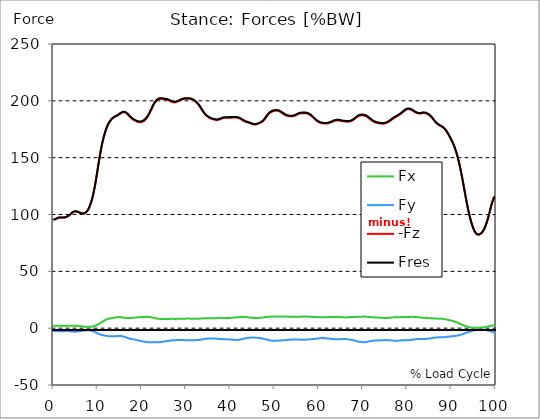
| Category |  Fx |  Fy |  -Fz |  Fres |
|---|---|---|---|---|
| 0.0 | 2.021 | -2.411 | 95.448 | 95.507 |
| 0.167348456675344 | 2.024 | -2.442 | 95.588 | 95.648 |
| 0.334696913350688 | 2.028 | -2.484 | 95.779 | 95.838 |
| 0.5020453700260321 | 2.035 | -2.538 | 96.024 | 96.086 |
| 0.669393826701376 | 2.042 | -2.602 | 96.321 | 96.384 |
| 0.83674228337672 | 2.05 | -2.669 | 96.655 | 96.721 |
| 1.0040907400520642 | 2.056 | -2.726 | 96.959 | 97.026 |
| 1.1621420602454444 | 2.06 | -2.761 | 97.179 | 97.247 |
| 1.3294905169207885 | 2.062 | -2.774 | 97.319 | 97.388 |
| 1.4968389735961325 | 2.06 | -2.769 | 97.39 | 97.458 |
| 1.6641874302714765 | 2.056 | -2.75 | 97.405 | 97.472 |
| 1.8315358869468206 | 2.05 | -2.72 | 97.379 | 97.446 |
| 1.9988843436221646 | 2.041 | -2.681 | 97.332 | 97.397 |
| 2.1662328002975086 | 2.034 | -2.64 | 97.293 | 97.358 |
| 2.333581256972853 | 2.029 | -2.6 | 97.294 | 97.359 |
| 2.5009297136481967 | 2.03 | -2.564 | 97.353 | 97.417 |
| 2.6682781703235405 | 2.036 | -2.534 | 97.479 | 97.542 |
| 2.8356266269988843 | 2.045 | -2.516 | 97.677 | 97.739 |
| 3.002975083674229 | 2.06 | -2.515 | 97.94 | 98.003 |
| 3.1703235403495724 | 2.079 | -2.536 | 98.264 | 98.329 |
| 3.337671997024917 | 2.101 | -2.574 | 98.644 | 98.708 |
| 3.4957233172182973 | 2.122 | -2.627 | 99.078 | 99.144 |
| 3.663071773893641 | 2.143 | -2.694 | 99.569 | 99.637 |
| 3.8304202305689854 | 2.164 | -2.773 | 100.122 | 100.193 |
| 3.997768687244329 | 2.185 | -2.861 | 100.728 | 100.801 |
| 4.165117143919673 | 2.199 | -2.948 | 101.322 | 101.398 |
| 4.332465600595017 | 2.202 | -3.022 | 101.845 | 101.922 |
| 4.499814057270361 | 2.193 | -3.079 | 102.248 | 102.326 |
| 4.667162513945706 | 2.174 | -3.112 | 102.524 | 102.604 |
| 4.834510970621049 | 2.144 | -3.125 | 102.681 | 102.761 |
| 5.001859427296393 | 2.105 | -3.117 | 102.729 | 102.807 |
| 5.169207883971737 | 2.059 | -3.087 | 102.68 | 102.756 |
| 5.336556340647081 | 2.006 | -3.038 | 102.551 | 102.625 |
| 5.503904797322425 | 1.95 | -2.971 | 102.359 | 102.43 |
| 5.671253253997769 | 1.891 | -2.887 | 102.12 | 102.188 |
| 5.82930457419115 | 1.829 | -2.788 | 101.852 | 101.917 |
| 5.996653030866494 | 1.764 | -2.679 | 101.573 | 101.634 |
| 6.164001487541838 | 1.696 | -2.564 | 101.299 | 101.356 |
| 6.331349944217181 | 1.625 | -2.448 | 101.064 | 101.117 |
| 6.498698400892526 | 1.555 | -2.332 | 100.896 | 100.946 |
| 6.66604685756787 | 1.485 | -2.221 | 100.825 | 100.871 |
| 6.833395314243213 | 1.418 | -2.115 | 100.86 | 100.903 |
| 7.000743770918558 | 1.354 | -2.019 | 101.012 | 101.052 |
| 7.168092227593902 | 1.298 | -1.939 | 101.306 | 101.344 |
| 7.335440684269246 | 1.25 | -1.879 | 101.753 | 101.79 |
| 7.50278914094459 | 1.21 | -1.84 | 102.367 | 102.403 |
| 7.6701375976199335 | 1.184 | -1.827 | 103.165 | 103.2 |
| 7.837486054295278 | 1.169 | -1.841 | 104.157 | 104.193 |
| 7.995537374488658 | 1.169 | -1.884 | 105.351 | 105.388 |
| 8.162885831164003 | 1.183 | -1.956 | 106.761 | 106.799 |
| 8.330234287839346 | 1.217 | -2.064 | 108.408 | 108.45 |
| 8.49758274451469 | 1.271 | -2.207 | 110.308 | 110.353 |
| 8.664931201190035 | 1.351 | -2.381 | 112.468 | 112.517 |
| 8.832279657865378 | 1.461 | -2.587 | 114.893 | 114.949 |
| 8.999628114540721 | 1.602 | -2.82 | 117.588 | 117.65 |
| 9.166976571216066 | 1.777 | -3.079 | 120.564 | 120.635 |
| 9.334325027891412 | 1.986 | -3.362 | 123.842 | 123.922 |
| 9.501673484566755 | 2.229 | -3.664 | 127.415 | 127.507 |
| 9.669021941242098 | 2.5 | -3.976 | 131.236 | 131.341 |
| 9.836370397917442 | 2.798 | -4.286 | 135.238 | 135.355 |
| 10.003718854592787 | 3.119 | -4.584 | 139.336 | 139.467 |
| 10.17106731126813 | 3.459 | -4.864 | 143.44 | 143.584 |
| 10.329118631461512 | 3.82 | -5.125 | 147.479 | 147.637 |
| 10.496467088136853 | 4.199 | -5.366 | 151.376 | 151.549 |
| 10.663815544812199 | 4.59 | -5.587 | 155.054 | 155.242 |
| 10.831164001487544 | 4.993 | -5.791 | 158.492 | 158.694 |
| 10.998512458162887 | 5.403 | -5.981 | 161.668 | 161.887 |
| 11.16586091483823 | 5.814 | -6.156 | 164.581 | 164.817 |
| 11.333209371513574 | 6.22 | -6.314 | 167.245 | 167.496 |
| 11.50055782818892 | 6.609 | -6.452 | 169.673 | 169.94 |
| 11.667906284864264 | 6.979 | -6.574 | 171.88 | 172.163 |
| 11.835254741539607 | 7.316 | -6.682 | 173.889 | 174.187 |
| 12.00260319821495 | 7.616 | -6.781 | 175.7 | 176.011 |
| 12.169951654890292 | 7.881 | -6.873 | 177.319 | 177.641 |
| 12.337300111565641 | 8.114 | -6.958 | 178.751 | 179.086 |
| 12.504648568240984 | 8.317 | -7.035 | 180.013 | 180.359 |
| 12.662699888434362 | 8.493 | -7.098 | 181.122 | 181.477 |
| 12.830048345109708 | 8.64 | -7.143 | 182.097 | 182.46 |
| 12.997396801785053 | 8.761 | -7.175 | 182.957 | 183.326 |
| 13.164745258460396 | 8.866 | -7.203 | 183.709 | 184.084 |
| 13.33209371513574 | 8.961 | -7.217 | 184.359 | 184.738 |
| 13.499442171811083 | 9.05 | -7.213 | 184.913 | 185.296 |
| 13.666790628486426 | 9.146 | -7.186 | 185.378 | 185.764 |
| 13.834139085161771 | 9.254 | -7.134 | 185.765 | 186.155 |
| 14.001487541837117 | 9.377 | -7.061 | 186.093 | 186.486 |
| 14.16883599851246 | 9.503 | -6.977 | 186.392 | 186.787 |
| 14.336184455187803 | 9.604 | -6.899 | 186.716 | 187.113 |
| 14.503532911863147 | 9.668 | -6.839 | 187.087 | 187.484 |
| 14.670881368538492 | 9.696 | -6.803 | 187.499 | 187.894 |
| 14.828932688731873 | 9.699 | -6.796 | 187.935 | 188.327 |
| 14.996281145407215 | 9.689 | -6.815 | 188.375 | 188.766 |
| 15.163629602082558 | 9.662 | -6.851 | 188.817 | 189.207 |
| 15.330978058757903 | 9.595 | -6.915 | 189.248 | 189.636 |
| 15.498326515433247 | 9.498 | -7.021 | 189.617 | 190.004 |
| 15.665674972108594 | 9.381 | -7.169 | 189.884 | 190.271 |
| 15.833023428783937 | 9.257 | -7.35 | 190.019 | 190.408 |
| 16.00037188545928 | 9.143 | -7.556 | 190.012 | 190.405 |
| 16.167720342134626 | 9.046 | -7.78 | 189.865 | 190.264 |
| 16.335068798809967 | 8.974 | -8.013 | 189.584 | 189.991 |
| 16.502417255485312 | 8.926 | -8.245 | 189.181 | 189.597 |
| 16.669765712160658 | 8.904 | -8.466 | 188.667 | 189.093 |
| 16.837114168836 | 8.905 | -8.675 | 188.053 | 188.491 |
| 17.004462625511344 | 8.923 | -8.873 | 187.371 | 187.821 |
| 17.16251394570472 | 8.952 | -9.064 | 186.669 | 187.132 |
| 17.32986240238007 | 8.986 | -9.246 | 185.988 | 186.464 |
| 17.497210859055414 | 9.025 | -9.416 | 185.337 | 185.825 |
| 17.664559315730756 | 9.071 | -9.568 | 184.733 | 185.232 |
| 17.8319077724061 | 9.121 | -9.702 | 184.185 | 184.696 |
| 17.999256229081443 | 9.168 | -9.817 | 183.697 | 184.218 |
| 18.166604685756788 | 9.21 | -9.923 | 183.261 | 183.791 |
| 18.333953142432133 | 9.251 | -10.034 | 182.865 | 183.404 |
| 18.501301599107478 | 9.3 | -10.152 | 182.503 | 183.05 |
| 18.668650055782823 | 9.355 | -10.283 | 182.169 | 182.729 |
| 18.835998512458165 | 9.415 | -10.419 | 181.871 | 182.442 |
| 19.00334696913351 | 9.477 | -10.559 | 181.614 | 182.196 |
| 19.170695425808855 | 9.538 | -10.71 | 181.409 | 182.005 |
| 19.338043882484197 | 9.599 | -10.871 | 181.267 | 181.875 |
| 19.496095202677576 | 9.653 | -11.04 | 181.195 | 181.816 |
| 19.66344365935292 | 9.699 | -11.209 | 181.194 | 181.827 |
| 19.830792116028263 | 9.743 | -11.364 | 181.267 | 181.911 |
| 19.998140572703612 | 9.787 | -11.493 | 181.423 | 182.077 |
| 20.165489029378953 | 9.825 | -11.598 | 181.661 | 182.321 |
| 20.3328374860543 | 9.86 | -11.697 | 181.986 | 182.653 |
| 20.500185942729644 | 9.891 | -11.8 | 182.413 | 183.086 |
| 20.667534399404985 | 9.917 | -11.91 | 182.945 | 183.624 |
| 20.83488285608033 | 9.943 | -12.026 | 183.579 | 184.264 |
| 21.002231312755672 | 9.967 | -12.141 | 184.311 | 185.003 |
| 21.16957976943102 | 9.977 | -12.238 | 185.15 | 185.844 |
| 21.336928226106362 | 9.962 | -12.311 | 186.108 | 186.803 |
| 21.504276682781704 | 9.921 | -12.363 | 187.189 | 187.881 |
| 21.67162513945705 | 9.862 | -12.404 | 188.384 | 189.071 |
| 21.82967645965043 | 9.786 | -12.436 | 189.68 | 190.361 |
| 21.997024916325774 | 9.692 | -12.457 | 191.05 | 191.721 |
| 22.16437337300112 | 9.581 | -12.469 | 192.458 | 193.122 |
| 22.33172182967646 | 9.453 | -12.474 | 193.861 | 194.515 |
| 22.499070286351806 | 9.304 | -12.47 | 195.205 | 195.848 |
| 22.666418743027148 | 9.143 | -12.462 | 196.454 | 197.086 |
| 22.833767199702496 | 8.978 | -12.452 | 197.585 | 198.205 |
| 23.00111565637784 | 8.813 | -12.445 | 198.583 | 199.192 |
| 23.168464113053183 | 8.651 | -12.438 | 199.442 | 200.04 |
| 23.335812569728528 | 8.509 | -12.428 | 200.16 | 200.749 |
| 23.50316102640387 | 8.391 | -12.41 | 200.735 | 201.315 |
| 23.670509483079215 | 8.298 | -12.38 | 201.17 | 201.743 |
| 23.83785793975456 | 8.233 | -12.336 | 201.479 | 202.045 |
| 23.995909259947936 | 8.186 | -12.283 | 201.675 | 202.235 |
| 24.163257716623285 | 8.158 | -12.221 | 201.772 | 202.326 |
| 24.330606173298627 | 8.142 | -12.153 | 201.793 | 202.342 |
| 24.49795462997397 | 8.134 | -12.077 | 201.757 | 202.301 |
| 24.665303086649313 | 8.13 | -11.988 | 201.676 | 202.214 |
| 24.83265154332466 | 8.125 | -11.891 | 201.573 | 202.106 |
| 25.0 | 8.117 | -11.782 | 201.472 | 201.998 |
| 25.167348456675345 | 8.108 | -11.671 | 201.381 | 201.9 |
| 25.334696913350694 | 8.107 | -11.562 | 201.31 | 201.823 |
| 25.502045370026035 | 8.109 | -11.455 | 201.228 | 201.735 |
| 25.669393826701377 | 8.114 | -11.357 | 201.088 | 201.589 |
| 25.836742283376722 | 8.116 | -11.268 | 200.879 | 201.375 |
| 26.004090740052067 | 8.117 | -11.184 | 200.625 | 201.118 |
| 26.17143919672741 | 8.126 | -11.103 | 200.34 | 200.829 |
| 26.329490516920792 | 8.146 | -11.019 | 200.021 | 200.507 |
| 26.49683897359613 | 8.167 | -10.933 | 199.687 | 200.169 |
| 26.66418743027148 | 8.184 | -10.839 | 199.357 | 199.836 |
| 26.831535886946828 | 8.193 | -10.749 | 199.061 | 199.536 |
| 26.998884343622166 | 8.191 | -10.672 | 198.835 | 199.306 |
| 27.166232800297514 | 8.181 | -10.613 | 198.689 | 199.156 |
| 27.333581256972852 | 8.17 | -10.572 | 198.633 | 199.097 |
| 27.5009297136482 | 8.165 | -10.544 | 198.668 | 199.13 |
| 27.668278170323543 | 8.171 | -10.526 | 198.797 | 199.258 |
| 27.835626626998888 | 8.179 | -10.513 | 199.008 | 199.467 |
| 28.002975083674233 | 8.188 | -10.5 | 199.292 | 199.749 |
| 28.170323540349575 | 8.196 | -10.483 | 199.62 | 200.075 |
| 28.33767199702492 | 8.205 | -10.461 | 199.964 | 200.417 |
| 28.50502045370026 | 8.208 | -10.442 | 200.283 | 200.735 |
| 28.663071773893645 | 8.207 | -10.433 | 200.56 | 201.009 |
| 28.830420230568986 | 8.209 | -10.433 | 200.816 | 201.264 |
| 28.99776868724433 | 8.214 | -10.447 | 201.075 | 201.524 |
| 29.165117143919673 | 8.221 | -10.477 | 201.33 | 201.78 |
| 29.33246560059502 | 8.236 | -10.508 | 201.549 | 202.001 |
| 29.499814057270367 | 8.259 | -10.533 | 201.703 | 202.158 |
| 29.66716251394571 | 8.3 | -10.55 | 201.799 | 202.256 |
| 29.834510970621054 | 8.351 | -10.552 | 201.842 | 202.303 |
| 30.00185942729639 | 8.402 | -10.55 | 201.85 | 202.313 |
| 30.169207883971744 | 8.445 | -10.549 | 201.835 | 202.301 |
| 30.33655634064708 | 8.47 | -10.55 | 201.814 | 202.281 |
| 30.50390479732243 | 8.468 | -10.554 | 201.801 | 202.268 |
| 30.671253253997772 | 8.44 | -10.556 | 201.793 | 202.259 |
| 30.829304574191156 | 8.39 | -10.556 | 201.77 | 202.234 |
| 30.996653030866494 | 8.339 | -10.557 | 201.69 | 202.15 |
| 31.164001487541842 | 8.294 | -10.558 | 201.533 | 201.992 |
| 31.331349944217187 | 8.257 | -10.559 | 201.304 | 201.762 |
| 31.498698400892525 | 8.224 | -10.557 | 201.008 | 201.464 |
| 31.666046857567874 | 8.2 | -10.553 | 200.65 | 201.104 |
| 31.833395314243212 | 8.185 | -10.545 | 200.228 | 200.682 |
| 32.00074377091856 | 8.182 | -10.531 | 199.745 | 200.199 |
| 32.1680922275939 | 8.19 | -10.511 | 199.202 | 199.656 |
| 32.33544068426925 | 8.207 | -10.487 | 198.603 | 199.058 |
| 32.50278914094459 | 8.23 | -10.458 | 197.951 | 198.406 |
| 32.670137597619934 | 8.258 | -10.421 | 197.243 | 197.698 |
| 32.83748605429528 | 8.294 | -10.369 | 196.464 | 196.92 |
| 33.004834510970625 | 8.338 | -10.299 | 195.601 | 196.056 |
| 33.162885831164004 | 8.389 | -10.21 | 194.659 | 195.114 |
| 33.33023428783935 | 8.444 | -10.105 | 193.648 | 194.101 |
| 33.497582744514695 | 8.501 | -9.986 | 192.584 | 193.036 |
| 33.664931201190036 | 8.557 | -9.855 | 191.526 | 191.977 |
| 33.83227965786538 | 8.609 | -9.72 | 190.524 | 190.973 |
| 33.99962811454073 | 8.654 | -9.587 | 189.597 | 190.043 |
| 34.16697657121607 | 8.689 | -9.468 | 188.76 | 189.203 |
| 34.33432502789141 | 8.71 | -9.372 | 188.017 | 188.458 |
| 34.50167348456676 | 8.716 | -9.305 | 187.365 | 187.805 |
| 34.6690219412421 | 8.709 | -9.248 | 186.778 | 187.216 |
| 34.83637039791744 | 8.696 | -9.196 | 186.242 | 186.679 |
| 35.00371885459279 | 8.678 | -9.152 | 185.761 | 186.196 |
| 35.17106731126814 | 8.658 | -9.117 | 185.331 | 185.764 |
| 35.338415767943474 | 8.644 | -9.092 | 184.95 | 185.383 |
| 35.49646708813686 | 8.635 | -9.073 | 184.624 | 185.057 |
| 35.6638155448122 | 8.627 | -9.058 | 184.349 | 184.78 |
| 35.831164001487544 | 8.62 | -9.05 | 184.117 | 184.549 |
| 35.998512458162885 | 8.618 | -9.057 | 183.918 | 184.35 |
| 36.165860914838234 | 8.632 | -9.08 | 183.731 | 184.165 |
| 36.333209371513576 | 8.665 | -9.11 | 183.55 | 183.988 |
| 36.50055782818892 | 8.719 | -9.147 | 183.382 | 183.826 |
| 36.667906284864266 | 8.79 | -9.193 | 183.248 | 183.697 |
| 36.83525474153961 | 8.868 | -9.247 | 183.16 | 183.617 |
| 37.002603198214956 | 8.943 | -9.299 | 183.141 | 183.604 |
| 37.1699516548903 | 9.007 | -9.35 | 183.199 | 183.668 |
| 37.337300111565646 | 9.054 | -9.4 | 183.335 | 183.808 |
| 37.50464856824098 | 9.083 | -9.45 | 183.536 | 184.013 |
| 37.66269988843437 | 9.092 | -9.5 | 183.782 | 184.263 |
| 37.83004834510971 | 9.084 | -9.55 | 184.053 | 184.535 |
| 37.99739680178505 | 9.065 | -9.599 | 184.326 | 184.807 |
| 38.16474525846039 | 9.039 | -9.64 | 184.578 | 185.06 |
| 38.33209371513574 | 9.011 | -9.679 | 184.802 | 185.283 |
| 38.49944217181109 | 8.984 | -9.711 | 184.98 | 185.462 |
| 38.666790628486424 | 8.962 | -9.741 | 185.102 | 185.583 |
| 38.83413908516178 | 8.944 | -9.764 | 185.165 | 185.647 |
| 39.001487541837115 | 8.932 | -9.781 | 185.177 | 185.658 |
| 39.16883599851246 | 8.925 | -9.797 | 185.159 | 185.64 |
| 39.336184455187805 | 8.927 | -9.817 | 185.146 | 185.629 |
| 39.503532911863154 | 8.936 | -9.843 | 185.15 | 185.635 |
| 39.670881368538495 | 8.957 | -9.876 | 185.167 | 185.654 |
| 39.83822982521384 | 8.99 | -9.916 | 185.193 | 185.683 |
| 39.996281145407224 | 9.035 | -9.964 | 185.214 | 185.709 |
| 40.163629602082565 | 9.092 | -10.02 | 185.222 | 185.724 |
| 40.33097805875791 | 9.153 | -10.079 | 185.223 | 185.732 |
| 40.498326515433256 | 9.214 | -10.136 | 185.223 | 185.738 |
| 40.6656749721086 | 9.272 | -10.188 | 185.233 | 185.755 |
| 40.83302342878393 | 9.326 | -10.235 | 185.259 | 185.786 |
| 41.00037188545929 | 9.377 | -10.275 | 185.292 | 185.823 |
| 41.16772034213463 | 9.428 | -10.309 | 185.309 | 185.846 |
| 41.33506879880997 | 9.484 | -10.331 | 185.288 | 185.829 |
| 41.50241725548531 | 9.544 | -10.336 | 185.217 | 185.762 |
| 41.66976571216066 | 9.607 | -10.321 | 185.092 | 185.639 |
| 41.837114168836 | 9.668 | -10.283 | 184.913 | 185.462 |
| 42.004462625511344 | 9.728 | -10.219 | 184.679 | 185.229 |
| 42.17181108218669 | 9.784 | -10.128 | 184.393 | 184.942 |
| 42.32986240238007 | 9.838 | -10.015 | 184.059 | 184.606 |
| 42.497210859055414 | 9.886 | -9.876 | 183.675 | 184.219 |
| 42.66455931573076 | 9.921 | -9.713 | 183.257 | 183.795 |
| 42.831907772406105 | 9.94 | -9.535 | 182.835 | 183.366 |
| 42.999256229081446 | 9.942 | -9.347 | 182.441 | 182.964 |
| 43.16660468575679 | 9.923 | -9.16 | 182.091 | 182.606 |
| 43.33395314243214 | 9.882 | -8.984 | 181.786 | 182.291 |
| 43.50130159910748 | 9.817 | -8.824 | 181.529 | 182.022 |
| 43.66865005578282 | 9.732 | -8.687 | 181.306 | 181.789 |
| 43.83599851245817 | 9.638 | -8.573 | 181.105 | 181.578 |
| 44.00334696913351 | 9.544 | -8.49 | 180.919 | 181.382 |
| 44.17069542580886 | 9.452 | -8.428 | 180.73 | 181.185 |
| 44.3380438824842 | 9.365 | -8.383 | 180.521 | 180.969 |
| 44.49609520267758 | 9.284 | -8.349 | 180.287 | 180.728 |
| 44.66344365935292 | 9.207 | -8.321 | 180.028 | 180.465 |
| 44.83079211602827 | 9.14 | -8.3 | 179.764 | 180.195 |
| 44.99814057270361 | 9.085 | -8.285 | 179.523 | 179.951 |
| 45.16548902937895 | 9.042 | -8.284 | 179.34 | 179.766 |
| 45.332837486054295 | 9.01 | -8.296 | 179.223 | 179.65 |
| 45.500185942729644 | 8.992 | -8.323 | 179.179 | 179.604 |
| 45.66753439940499 | 8.983 | -8.364 | 179.198 | 179.624 |
| 45.83488285608033 | 8.987 | -8.413 | 179.282 | 179.711 |
| 46.00223131275568 | 8.999 | -8.471 | 179.425 | 179.858 |
| 46.16957976943102 | 9.018 | -8.536 | 179.626 | 180.062 |
| 46.336928226106366 | 9.045 | -8.603 | 179.875 | 180.314 |
| 46.50427668278171 | 9.084 | -8.674 | 180.148 | 180.593 |
| 46.671625139457056 | 9.135 | -8.75 | 180.434 | 180.883 |
| 46.829676459650436 | 9.195 | -8.837 | 180.735 | 181.19 |
| 46.99702491632577 | 9.257 | -8.936 | 181.07 | 181.533 |
| 47.16437337300112 | 9.325 | -9.05 | 181.465 | 181.937 |
| 47.33172182967646 | 9.404 | -9.181 | 181.954 | 182.435 |
| 47.49907028635181 | 9.489 | -9.327 | 182.552 | 183.044 |
| 47.66641874302716 | 9.581 | -9.489 | 183.27 | 183.773 |
| 47.83376719970249 | 9.681 | -9.673 | 184.112 | 184.627 |
| 48.001115656377834 | 9.789 | -9.866 | 185.042 | 185.571 |
| 48.16846411305319 | 9.889 | -10.05 | 185.981 | 186.522 |
| 48.33581256972853 | 9.971 | -10.217 | 186.863 | 187.416 |
| 48.50316102640387 | 10.034 | -10.373 | 187.666 | 188.229 |
| 48.67050948307921 | 10.077 | -10.519 | 188.38 | 188.951 |
| 48.837857939754564 | 10.104 | -10.649 | 189.006 | 189.584 |
| 49.005206396429905 | 10.126 | -10.768 | 189.541 | 190.126 |
| 49.163257716623285 | 10.148 | -10.876 | 189.986 | 190.579 |
| 49.33060617329863 | 10.17 | -10.967 | 190.35 | 190.949 |
| 49.49795462997397 | 10.192 | -11.039 | 190.643 | 191.246 |
| 49.66530308664932 | 10.212 | -11.089 | 190.872 | 191.479 |
| 49.832651543324666 | 10.23 | -11.115 | 191.046 | 191.656 |
| 50.0 | 10.242 | -11.12 | 191.176 | 191.786 |
| 50.16734845667534 | 10.244 | -11.101 | 191.267 | 191.878 |
| 50.33469691335069 | 10.234 | -11.064 | 191.323 | 191.931 |
| 50.50204537002604 | 10.213 | -11.01 | 191.34 | 191.944 |
| 50.66939382670139 | 10.192 | -10.95 | 191.3 | 191.899 |
| 50.836742283376715 | 10.179 | -10.888 | 191.176 | 191.771 |
| 51.00409074005207 | 10.177 | -10.829 | 190.964 | 191.557 |
| 51.17143919672741 | 10.181 | -10.775 | 190.664 | 191.255 |
| 51.32949051692079 | 10.189 | -10.729 | 190.3 | 190.89 |
| 51.496838973596134 | 10.198 | -10.697 | 189.909 | 190.499 |
| 51.66418743027148 | 10.21 | -10.673 | 189.495 | 190.085 |
| 51.831535886946824 | 10.218 | -10.648 | 189.06 | 189.65 |
| 51.99888434362217 | 10.22 | -10.621 | 188.612 | 189.203 |
| 52.16623280029752 | 10.213 | -10.593 | 188.167 | 188.757 |
| 52.33358125697285 | 10.206 | -10.564 | 187.748 | 188.336 |
| 52.5009297136482 | 10.198 | -10.528 | 187.374 | 187.961 |
| 52.668278170323546 | 10.185 | -10.48 | 187.058 | 187.642 |
| 52.835626626998895 | 10.159 | -10.414 | 186.815 | 187.395 |
| 53.00297508367424 | 10.127 | -10.34 | 186.626 | 187.202 |
| 53.17032354034958 | 10.092 | -10.263 | 186.483 | 187.053 |
| 53.33767199702492 | 10.056 | -10.183 | 186.392 | 186.956 |
| 53.50502045370027 | 10.031 | -10.106 | 186.341 | 186.9 |
| 53.663071773893655 | 10.018 | -10.036 | 186.321 | 186.877 |
| 53.83042023056899 | 10.017 | -9.983 | 186.333 | 186.885 |
| 53.99776868724433 | 10.021 | -9.952 | 186.38 | 186.931 |
| 54.16511714391967 | 10.021 | -9.946 | 186.471 | 187.021 |
| 54.33246560059503 | 10.016 | -9.953 | 186.609 | 187.158 |
| 54.49981405727037 | 10.003 | -9.966 | 186.801 | 187.35 |
| 54.667162513945705 | 9.989 | -9.985 | 187.045 | 187.593 |
| 54.834510970621054 | 9.972 | -10.002 | 187.338 | 187.885 |
| 55.0018594272964 | 9.957 | -10.013 | 187.673 | 188.219 |
| 55.169207883971744 | 9.948 | -10.021 | 188.025 | 188.57 |
| 55.336556340647086 | 9.947 | -10.026 | 188.349 | 188.892 |
| 55.50390479732243 | 9.959 | -10.037 | 188.613 | 189.157 |
| 55.671253253997776 | 9.991 | -10.056 | 188.817 | 189.364 |
| 55.83860171067312 | 10.036 | -10.081 | 188.962 | 189.512 |
| 55.9966530308665 | 10.101 | -10.115 | 189.056 | 189.612 |
| 56.16400148754184 | 10.172 | -10.145 | 189.112 | 189.674 |
| 56.33134994421718 | 10.236 | -10.159 | 189.137 | 189.704 |
| 56.498698400892536 | 10.287 | -10.161 | 189.143 | 189.713 |
| 56.66604685756788 | 10.32 | -10.151 | 189.147 | 189.718 |
| 56.83339531424321 | 10.331 | -10.133 | 189.136 | 189.707 |
| 57.00074377091856 | 10.326 | -10.107 | 189.102 | 189.672 |
| 57.16809222759391 | 10.309 | -10.073 | 189.033 | 189.6 |
| 57.33544068426925 | 10.278 | -10.032 | 188.908 | 189.473 |
| 57.5027891409446 | 10.232 | -9.984 | 188.717 | 189.276 |
| 57.670137597619934 | 10.177 | -9.934 | 188.452 | 189.007 |
| 57.83748605429528 | 10.117 | -9.885 | 188.124 | 188.674 |
| 58.004834510970625 | 10.055 | -9.836 | 187.738 | 188.283 |
| 58.16288583116401 | 9.996 | -9.778 | 187.297 | 187.837 |
| 58.330234287839346 | 9.942 | -9.716 | 186.804 | 187.338 |
| 58.497582744514695 | 9.896 | -9.655 | 186.255 | 186.786 |
| 58.66493120119004 | 9.858 | -9.597 | 185.654 | 186.181 |
| 58.832279657865385 | 9.834 | -9.542 | 185.015 | 185.54 |
| 58.999628114540734 | 9.819 | -9.479 | 184.379 | 184.902 |
| 59.16697657121607 | 9.804 | -9.401 | 183.762 | 184.281 |
| 59.33432502789142 | 9.789 | -9.314 | 183.169 | 183.685 |
| 59.50167348456676 | 9.771 | -9.222 | 182.619 | 183.131 |
| 59.66902194124211 | 9.745 | -9.129 | 182.125 | 182.633 |
| 59.83637039791745 | 9.714 | -9.037 | 181.691 | 182.193 |
| 60.00371885459278 | 9.68 | -8.951 | 181.315 | 181.811 |
| 60.17106731126813 | 9.644 | -8.873 | 180.994 | 181.486 |
| 60.33841576794349 | 9.607 | -8.804 | 180.727 | 181.214 |
| 60.49646708813685 | 9.574 | -8.749 | 180.516 | 181 |
| 60.6638155448122 | 9.546 | -8.712 | 180.363 | 180.843 |
| 60.831164001487544 | 9.524 | -8.7 | 180.257 | 180.736 |
| 60.99851245816289 | 9.515 | -8.71 | 180.173 | 180.652 |
| 61.16586091483824 | 9.521 | -8.743 | 180.092 | 180.574 |
| 61.333209371513576 | 9.549 | -8.796 | 180.024 | 180.51 |
| 61.50055782818892 | 9.594 | -8.869 | 179.982 | 180.475 |
| 61.667906284864266 | 9.654 | -8.955 | 179.979 | 180.479 |
| 61.835254741539615 | 9.716 | -9.043 | 180.023 | 180.533 |
| 62.002603198214956 | 9.768 | -9.125 | 180.126 | 180.642 |
| 62.16995165489029 | 9.806 | -9.193 | 180.283 | 180.805 |
| 62.33730011156564 | 9.829 | -9.251 | 180.482 | 181.007 |
| 62.504648568240995 | 9.84 | -9.307 | 180.711 | 181.238 |
| 62.67199702491633 | 9.841 | -9.366 | 180.958 | 181.489 |
| 62.83004834510971 | 9.833 | -9.426 | 181.218 | 181.75 |
| 62.99739680178505 | 9.819 | -9.482 | 181.488 | 182.021 |
| 63.1647452584604 | 9.807 | -9.537 | 181.76 | 182.294 |
| 63.33209371513575 | 9.802 | -9.589 | 182.027 | 182.563 |
| 63.4994421718111 | 9.807 | -9.634 | 182.278 | 182.814 |
| 63.666790628486424 | 9.822 | -9.669 | 182.498 | 183.037 |
| 63.83413908516177 | 9.842 | -9.698 | 182.668 | 183.208 |
| 64.00148754183712 | 9.859 | -9.721 | 182.776 | 183.318 |
| 64.16883599851248 | 9.872 | -9.741 | 182.821 | 183.364 |
| 64.3361844551878 | 9.881 | -9.755 | 182.811 | 183.355 |
| 64.50353291186315 | 9.882 | -9.762 | 182.752 | 183.297 |
| 64.6708813685385 | 9.87 | -9.753 | 182.652 | 183.196 |
| 64.83822982521384 | 9.844 | -9.732 | 182.526 | 183.067 |
| 65.00557828188919 | 9.801 | -9.698 | 182.392 | 182.929 |
| 65.16362960208257 | 9.744 | -9.661 | 182.265 | 182.798 |
| 65.3309780587579 | 9.677 | -9.623 | 182.15 | 182.678 |
| 65.49832651543326 | 9.603 | -9.593 | 182.052 | 182.575 |
| 65.6656749721086 | 9.534 | -9.581 | 181.97 | 182.489 |
| 65.83302342878395 | 9.485 | -9.593 | 181.893 | 182.41 |
| 66.00037188545929 | 9.456 | -9.618 | 181.819 | 182.336 |
| 66.16772034213463 | 9.449 | -9.651 | 181.745 | 182.264 |
| 66.33506879880998 | 9.47 | -9.703 | 181.677 | 182.2 |
| 66.50241725548531 | 9.518 | -9.77 | 181.622 | 182.152 |
| 66.66976571216065 | 9.581 | -9.85 | 181.605 | 182.142 |
| 66.83711416883601 | 9.651 | -9.939 | 181.649 | 182.194 |
| 67.00446262551135 | 9.715 | -10.033 | 181.77 | 182.323 |
| 67.1718110821867 | 9.769 | -10.133 | 181.966 | 182.527 |
| 67.32986240238007 | 9.814 | -10.24 | 182.224 | 182.793 |
| 67.49721085905541 | 9.85 | -10.358 | 182.535 | 183.11 |
| 67.66455931573076 | 9.876 | -10.484 | 182.893 | 183.476 |
| 67.83190777240611 | 9.893 | -10.62 | 183.302 | 183.892 |
| 67.99925622908145 | 9.903 | -10.768 | 183.763 | 184.36 |
| 68.16660468575678 | 9.907 | -10.936 | 184.273 | 184.877 |
| 68.33395314243214 | 9.916 | -11.123 | 184.796 | 185.409 |
| 68.50130159910749 | 9.932 | -11.335 | 185.327 | 185.952 |
| 68.66865005578282 | 9.953 | -11.549 | 185.836 | 186.472 |
| 68.83599851245816 | 9.976 | -11.734 | 186.269 | 186.916 |
| 69.00334696913352 | 10.001 | -11.885 | 186.617 | 187.273 |
| 69.17069542580886 | 10.03 | -12.008 | 186.886 | 187.551 |
| 69.3380438824842 | 10.063 | -12.106 | 187.087 | 187.76 |
| 69.50539233915956 | 10.097 | -12.179 | 187.221 | 187.9 |
| 69.66344365935292 | 10.131 | -12.235 | 187.289 | 187.974 |
| 69.83079211602826 | 10.159 | -12.271 | 187.294 | 187.984 |
| 69.99814057270362 | 10.179 | -12.291 | 187.245 | 187.937 |
| 70.16548902937896 | 10.184 | -12.296 | 187.157 | 187.85 |
| 70.33283748605429 | 10.176 | -12.283 | 187.018 | 187.711 |
| 70.50018594272964 | 10.155 | -12.244 | 186.813 | 187.504 |
| 70.667534399405 | 10.119 | -12.177 | 186.54 | 187.226 |
| 70.83488285608033 | 10.069 | -12.082 | 186.206 | 186.884 |
| 71.00223131275568 | 10.006 | -11.964 | 185.809 | 186.479 |
| 71.16957976943102 | 9.934 | -11.828 | 185.354 | 186.014 |
| 71.33692822610637 | 9.854 | -11.678 | 184.839 | 185.487 |
| 71.50427668278171 | 9.778 | -11.534 | 184.289 | 184.927 |
| 71.67162513945706 | 9.707 | -11.407 | 183.736 | 184.365 |
| 71.8389735961324 | 9.642 | -11.3 | 183.209 | 183.83 |
| 71.99702491632577 | 9.589 | -11.207 | 182.732 | 183.347 |
| 72.16437337300113 | 9.547 | -11.124 | 182.304 | 182.912 |
| 72.33172182967647 | 9.518 | -11.055 | 181.915 | 182.52 |
| 72.49907028635181 | 9.495 | -10.995 | 181.571 | 182.172 |
| 72.66641874302715 | 9.476 | -10.94 | 181.278 | 181.876 |
| 72.8337671997025 | 9.453 | -10.892 | 181.031 | 181.625 |
| 73.00111565637783 | 9.427 | -10.847 | 180.818 | 181.408 |
| 73.16846411305319 | 9.395 | -10.807 | 180.63 | 181.218 |
| 73.33581256972853 | 9.357 | -10.769 | 180.466 | 181.05 |
| 73.50316102640387 | 9.312 | -10.735 | 180.327 | 180.907 |
| 73.67050948307921 | 9.262 | -10.707 | 180.214 | 180.791 |
| 73.83785793975457 | 9.208 | -10.681 | 180.124 | 180.697 |
| 74.00520639642991 | 9.159 | -10.655 | 180.046 | 180.616 |
| 74.16325771662328 | 9.122 | -10.631 | 179.978 | 180.544 |
| 74.33060617329863 | 9.094 | -10.607 | 179.929 | 180.493 |
| 74.49795462997398 | 9.073 | -10.584 | 179.914 | 180.476 |
| 74.66530308664932 | 9.053 | -10.562 | 179.947 | 180.506 |
| 74.83265154332466 | 9.036 | -10.54 | 180.035 | 180.592 |
| 75.00000000000001 | 9.025 | -10.521 | 180.178 | 180.733 |
| 75.16734845667534 | 9.025 | -10.507 | 180.374 | 180.927 |
| 75.3346969133507 | 9.034 | -10.503 | 180.618 | 181.17 |
| 75.50204537002605 | 9.052 | -10.514 | 180.912 | 181.466 |
| 75.66939382670138 | 9.081 | -10.54 | 181.253 | 181.809 |
| 75.83674228337672 | 9.121 | -10.579 | 181.634 | 182.193 |
| 76.00409074005208 | 9.174 | -10.633 | 182.05 | 182.616 |
| 76.17143919672742 | 9.236 | -10.697 | 182.499 | 183.07 |
| 76.33878765340276 | 9.303 | -10.769 | 182.97 | 183.548 |
| 76.49683897359614 | 9.371 | -10.842 | 183.449 | 184.033 |
| 76.66418743027148 | 9.439 | -10.915 | 183.921 | 184.512 |
| 76.83153588694682 | 9.503 | -10.983 | 184.379 | 184.976 |
| 76.99888434362218 | 9.56 | -11.043 | 184.814 | 185.418 |
| 77.16623280029752 | 9.605 | -11.086 | 185.224 | 185.833 |
| 77.33358125697285 | 9.632 | -11.108 | 185.606 | 186.217 |
| 77.5009297136482 | 9.647 | -11.107 | 185.981 | 186.593 |
| 77.66827817032356 | 9.651 | -11.082 | 186.367 | 186.978 |
| 77.83562662699889 | 9.656 | -11.037 | 186.76 | 187.367 |
| 78.00297508367423 | 9.665 | -10.983 | 187.155 | 187.759 |
| 78.17032354034959 | 9.675 | -10.917 | 187.549 | 188.148 |
| 78.33767199702493 | 9.686 | -10.848 | 187.961 | 188.555 |
| 78.50502045370027 | 9.7 | -10.785 | 188.408 | 188.998 |
| 78.67236891037561 | 9.717 | -10.743 | 188.895 | 189.481 |
| 78.83042023056899 | 9.737 | -10.721 | 189.414 | 189.998 |
| 78.99776868724433 | 9.761 | -10.716 | 189.957 | 190.54 |
| 79.16511714391969 | 9.779 | -10.726 | 190.52 | 191.103 |
| 79.33246560059503 | 9.787 | -10.737 | 191.072 | 191.654 |
| 79.49981405727036 | 9.794 | -10.738 | 191.579 | 192.159 |
| 79.66716251394571 | 9.807 | -10.721 | 192.009 | 192.588 |
| 79.83451097062107 | 9.825 | -10.69 | 192.351 | 192.928 |
| 80.00185942729641 | 9.847 | -10.648 | 192.593 | 193.167 |
| 80.16920788397174 | 9.869 | -10.598 | 192.735 | 193.307 |
| 80.33655634064709 | 9.892 | -10.541 | 192.767 | 193.336 |
| 80.50390479732243 | 9.913 | -10.477 | 192.695 | 193.262 |
| 80.67125325399778 | 9.933 | -10.403 | 192.53 | 193.093 |
| 80.83860171067312 | 9.947 | -10.321 | 192.283 | 192.843 |
| 80.99665303086651 | 9.95 | -10.228 | 191.967 | 192.523 |
| 81.16400148754184 | 9.942 | -10.13 | 191.599 | 192.15 |
| 81.3313499442172 | 9.923 | -10.026 | 191.188 | 191.733 |
| 81.49869840089255 | 9.891 | -9.92 | 190.748 | 191.287 |
| 81.66604685756786 | 9.851 | -9.819 | 190.309 | 190.842 |
| 81.83339531424322 | 9.807 | -9.732 | 189.911 | 190.437 |
| 82.00074377091858 | 9.758 | -9.658 | 189.568 | 190.089 |
| 82.16809222759392 | 9.702 | -9.596 | 189.289 | 189.803 |
| 82.33544068426926 | 9.639 | -9.544 | 189.072 | 189.58 |
| 82.50278914094459 | 9.568 | -9.501 | 188.92 | 189.421 |
| 82.67013759761994 | 9.493 | -9.465 | 188.832 | 189.328 |
| 82.83748605429528 | 9.414 | -9.44 | 188.807 | 189.296 |
| 83.00483451097062 | 9.336 | -9.43 | 188.847 | 189.331 |
| 83.17218296764597 | 9.265 | -9.436 | 188.946 | 189.426 |
| 83.33023428783935 | 9.207 | -9.451 | 189.095 | 189.572 |
| 83.4975827445147 | 9.161 | -9.471 | 189.256 | 189.731 |
| 83.66493120119004 | 9.126 | -9.485 | 189.38 | 189.854 |
| 83.83227965786537 | 9.094 | -9.49 | 189.412 | 189.884 |
| 83.99962811454073 | 9.062 | -9.483 | 189.35 | 189.821 |
| 84.16697657121607 | 9.026 | -9.461 | 189.198 | 189.666 |
| 84.33432502789142 | 8.989 | -9.42 | 188.962 | 189.427 |
| 84.50167348456677 | 8.946 | -9.363 | 188.651 | 189.112 |
| 84.6690219412421 | 8.897 | -9.293 | 188.281 | 188.738 |
| 84.83637039791745 | 8.844 | -9.212 | 187.864 | 188.315 |
| 85.0037188545928 | 8.79 | -9.126 | 187.398 | 187.844 |
| 85.17106731126813 | 8.741 | -9.032 | 186.875 | 187.316 |
| 85.33841576794349 | 8.7 | -8.928 | 186.283 | 186.719 |
| 85.50576422461883 | 8.665 | -8.813 | 185.616 | 186.047 |
| 85.66381554481221 | 8.638 | -8.691 | 184.867 | 185.293 |
| 85.83116400148755 | 8.617 | -8.564 | 184.034 | 184.456 |
| 85.99851245816289 | 8.593 | -8.444 | 183.145 | 183.564 |
| 86.16586091483823 | 8.559 | -8.343 | 182.289 | 182.706 |
| 86.33320937151358 | 8.518 | -8.259 | 181.507 | 181.921 |
| 86.50055782818893 | 8.474 | -8.19 | 180.805 | 181.216 |
| 86.66790628486427 | 8.43 | -8.136 | 180.182 | 180.592 |
| 86.83525474153961 | 8.393 | -8.099 | 179.638 | 180.047 |
| 87.00260319821496 | 8.37 | -8.083 | 179.162 | 179.569 |
| 87.16995165489031 | 8.363 | -8.081 | 178.729 | 179.138 |
| 87.33730011156564 | 8.365 | -8.09 | 178.331 | 178.742 |
| 87.504648568241 | 8.368 | -8.1 | 177.957 | 178.369 |
| 87.67199702491634 | 8.364 | -8.104 | 177.594 | 178.007 |
| 87.83004834510972 | 8.343 | -8.097 | 177.222 | 177.635 |
| 87.99739680178506 | 8.293 | -8.075 | 176.815 | 177.223 |
| 88.1647452584604 | 8.206 | -8.031 | 176.345 | 176.748 |
| 88.33209371513574 | 8.089 | -7.96 | 175.78 | 176.175 |
| 88.49944217181108 | 7.953 | -7.872 | 175.11 | 175.494 |
| 88.66679062848644 | 7.806 | -7.777 | 174.331 | 174.706 |
| 88.83413908516178 | 7.651 | -7.678 | 173.446 | 173.809 |
| 89.00148754183712 | 7.498 | -7.583 | 172.469 | 172.824 |
| 89.16883599851246 | 7.35 | -7.497 | 171.417 | 171.764 |
| 89.33618445518782 | 7.21 | -7.42 | 170.298 | 170.636 |
| 89.50353291186315 | 7.078 | -7.356 | 169.125 | 169.458 |
| 89.6708813685385 | 6.948 | -7.303 | 167.909 | 168.236 |
| 89.83822982521386 | 6.812 | -7.256 | 166.665 | 166.987 |
| 90.00557828188919 | 6.662 | -7.198 | 165.403 | 165.719 |
| 90.16362960208257 | 6.492 | -7.132 | 164.102 | 164.41 |
| 90.3309780587579 | 6.302 | -7.055 | 162.735 | 163.036 |
| 90.49832651543326 | 6.098 | -6.97 | 161.254 | 161.547 |
| 90.66567497210859 | 5.883 | -6.88 | 159.62 | 159.905 |
| 90.83302342878395 | 5.656 | -6.786 | 157.826 | 158.104 |
| 91.00037188545929 | 5.417 | -6.689 | 155.879 | 156.15 |
| 91.16772034213463 | 5.165 | -6.59 | 153.779 | 154.043 |
| 91.33506879880998 | 4.902 | -6.484 | 151.521 | 151.778 |
| 91.50241725548533 | 4.627 | -6.364 | 149.083 | 149.334 |
| 91.66976571216065 | 4.344 | -6.231 | 146.473 | 146.716 |
| 91.83711416883601 | 4.055 | -6.083 | 143.687 | 143.922 |
| 92.00446262551137 | 3.76 | -5.915 | 140.721 | 140.949 |
| 92.1718110821867 | 3.462 | -5.725 | 137.575 | 137.794 |
| 92.33915953886203 | 3.162 | -5.515 | 134.279 | 134.489 |
| 92.49721085905541 | 2.864 | -5.286 | 130.859 | 131.061 |
| 92.66455931573077 | 2.573 | -5.039 | 127.335 | 127.527 |
| 92.83190777240611 | 2.293 | -4.784 | 123.752 | 123.936 |
| 92.99925622908145 | 2.029 | -4.53 | 120.162 | 120.336 |
| 93.1666046857568 | 1.783 | -4.283 | 116.612 | 116.779 |
| 93.33395314243214 | 1.558 | -4.048 | 113.152 | 113.31 |
| 93.50130159910749 | 1.354 | -3.822 | 109.807 | 109.956 |
| 93.66865005578283 | 1.169 | -3.599 | 106.583 | 106.725 |
| 93.83599851245818 | 1.005 | -3.379 | 103.519 | 103.652 |
| 94.00334696913353 | 0.862 | -3.167 | 100.622 | 100.749 |
| 94.17069542580886 | 0.74 | -2.962 | 97.909 | 98.027 |
| 94.3380438824842 | 0.64 | -2.764 | 95.375 | 95.485 |
| 94.50539233915954 | 0.56 | -2.578 | 93.052 | 93.155 |
| 94.66344365935292 | 0.497 | -2.402 | 90.942 | 91.038 |
| 94.83079211602828 | 0.449 | -2.237 | 89.037 | 89.127 |
| 94.99814057270362 | 0.414 | -2.089 | 87.345 | 87.429 |
| 95.16548902937897 | 0.391 | -1.951 | 85.87 | 85.949 |
| 95.33283748605432 | 0.379 | -1.826 | 84.636 | 84.71 |
| 95.50018594272963 | 0.375 | -1.715 | 83.665 | 83.736 |
| 95.66753439940499 | 0.379 | -1.621 | 82.959 | 83.025 |
| 95.83488285608034 | 0.393 | -1.541 | 82.505 | 82.568 |
| 96.00223131275567 | 0.412 | -1.477 | 82.288 | 82.349 |
| 96.16957976943102 | 0.436 | -1.427 | 82.292 | 82.35 |
| 96.33692822610638 | 0.464 | -1.39 | 82.476 | 82.534 |
| 96.50427668278171 | 0.493 | -1.364 | 82.805 | 82.861 |
| 96.67162513945706 | 0.527 | -1.351 | 83.248 | 83.304 |
| 96.8389735961324 | 0.566 | -1.358 | 83.821 | 83.876 |
| 96.99702491632577 | 0.618 | -1.385 | 84.572 | 84.627 |
| 97.16437337300111 | 0.68 | -1.432 | 85.511 | 85.566 |
| 97.33172182967647 | 0.755 | -1.498 | 86.647 | 86.702 |
| 97.49907028635181 | 0.842 | -1.583 | 87.979 | 88.036 |
| 97.66641874302715 | 0.942 | -1.688 | 89.506 | 89.564 |
| 97.8337671997025 | 1.054 | -1.81 | 91.221 | 91.282 |
| 98.00111565637785 | 1.179 | -1.95 | 93.129 | 93.193 |
| 98.16846411305319 | 1.315 | -2.107 | 95.207 | 95.275 |
| 98.33581256972855 | 1.466 | -2.275 | 97.475 | 97.547 |
| 98.50316102640389 | 1.628 | -2.456 | 99.903 | 99.98 |
| 98.67050948307921 | 1.796 | -2.646 | 102.437 | 102.521 |
| 98.83785793975456 | 1.968 | -2.841 | 105.02 | 105.11 |
| 99.0052063964299 | 2.136 | -3.033 | 107.524 | 107.621 |
| 99.17255485310525 | 2.292 | -3.211 | 109.816 | 109.92 |
| 99.33060617329863 | 2.43 | -3.372 | 111.824 | 111.934 |
| 99.49795462997399 | 2.55 | -3.51 | 113.522 | 113.636 |
| 99.66530308664933 | 2.65 | -3.624 | 114.88 | 114.999 |
| 99.83265154332467 | 2.72 | -3.706 | 115.836 | 115.958 |
| 100.0 | 2.757 | -3.751 | 116.357 | 116.48 |